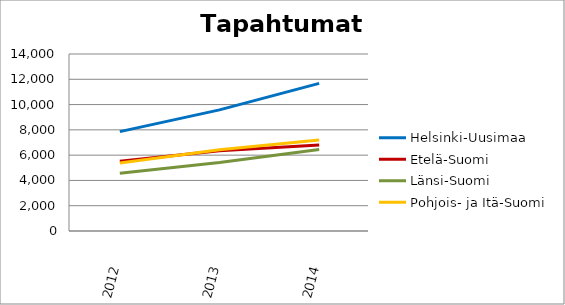
| Category | Helsinki-Uusimaa | Etelä-Suomi | Länsi-Suomi | Pohjois- ja Itä-Suomi |
|---|---|---|---|---|
| 2012.0 | 7859 | 5524 | 4568 | 5382 |
| 2013.0 | 9581 | 6343 | 5418 | 6434 |
| 2014.0 | 11679 | 6798 | 6445 | 7202 |